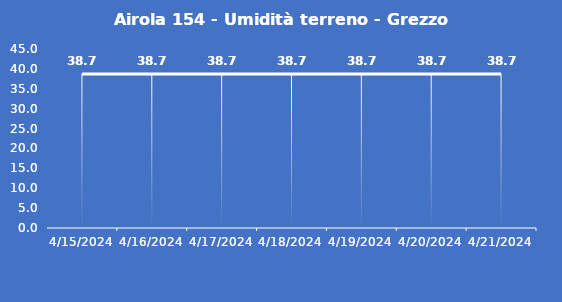
| Category | Airola 154 - Umidità terreno - Grezzo (%VWC) |
|---|---|
| 4/15/24 | 38.7 |
| 4/16/24 | 38.7 |
| 4/17/24 | 38.7 |
| 4/18/24 | 38.7 |
| 4/19/24 | 38.7 |
| 4/20/24 | 38.7 |
| 4/21/24 | 38.7 |